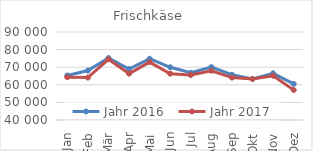
| Category | Jahr 2016 | Jahr 2017 |
|---|---|---|
| Jan | 65301.5 | 64293.439 |
| Feb | 68087.914 | 64093.819 |
| Mär | 75211.874 | 74499.445 |
| Apr | 68944.473 | 66359.032 |
| Mai | 74829.65 | 72911.081 |
| Jun | 69961.59 | 66309.12 |
| Jul | 66829.435 | 65537.674 |
| Aug | 70036.486 | 68006.637 |
| Sep | 65742.604 | 64083.067 |
| Okt | 63301.263 | 63327.14 |
| Nov | 66518.992 | 65126.15 |
| Dez | 60531.802 | 57056.034 |